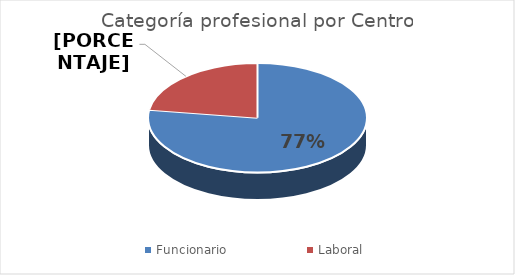
| Category | Series 0 |
|---|---|
| Funcionario | 75 |
| Laboral | 22 |